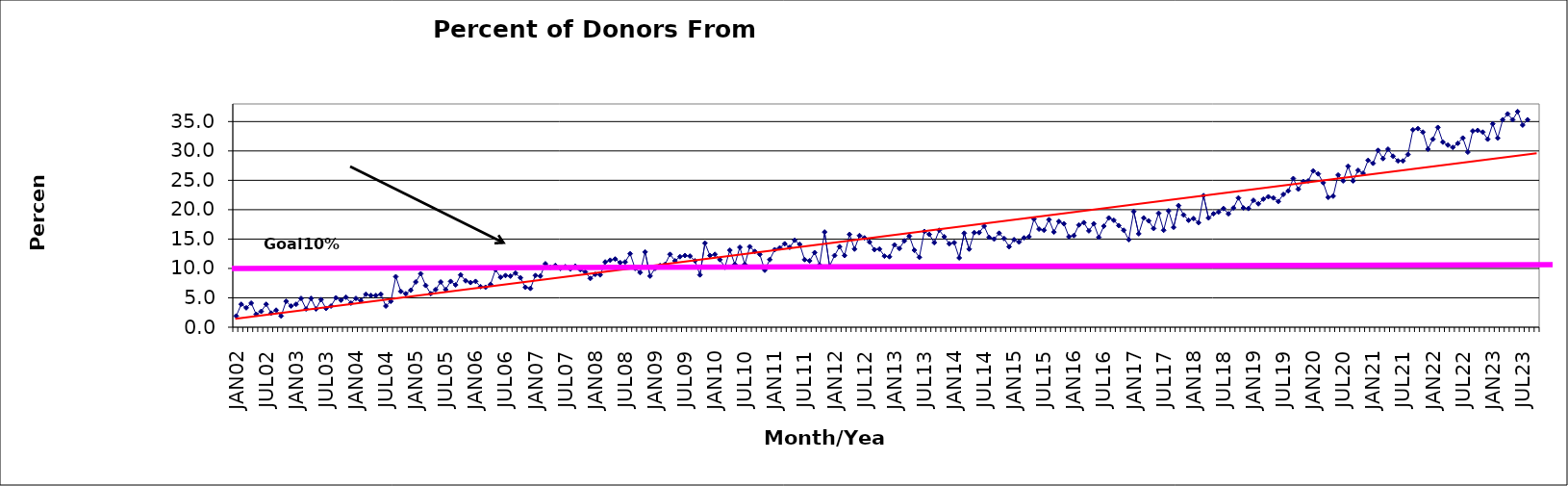
| Category | Series 0 |
|---|---|
| JAN02 | 1.9 |
| FEB02 | 3.9 |
| MAR02 | 3.3 |
| APR02 | 4.1 |
| MAY02 | 2.2 |
| JUN02 | 2.7 |
| JUL02 | 3.9 |
| AUG02 | 2.4 |
| SEP02 | 2.9 |
| OCT02 | 1.9 |
| NOV02 | 4.4 |
| DEC02 | 3.6 |
| JAN03 | 3.9 |
| FEB03 | 4.9 |
| MAR03 | 3.1 |
| APR03 | 4.9 |
| MAY03 | 3.1 |
| JUN03 | 4.7 |
| JUL03 | 3.2 |
| AUG03 | 3.6 |
| SEP03 | 5 |
| OCT03 | 4.6 |
| NOV03 | 5.1 |
| DEC03 | 4.1 |
| JAN04 | 4.9 |
| FEB04 | 4.5 |
| MAR04 | 5.6 |
| APR04 | 5.4 |
| MAY04 | 5.4 |
| JUN04 | 5.6 |
| JUL04 | 3.6 |
| AUG04 | 4.4 |
| SEP04 | 8.6 |
| OCT04 | 6.1 |
| NOV04 | 5.7 |
| DEC04 | 6.3 |
| JAN05 | 7.7 |
| FEB05 | 9.1 |
| MAR05 | 7.1 |
| APR05 | 5.7 |
| MAY05 | 6.4 |
| JUN05 | 7.7 |
| JUL05 | 6.4 |
| AUG05 | 7.8 |
| SEP05 | 7.2 |
| OCT05 | 8.9 |
| NOV05 | 7.9 |
| DEC05 | 7.6 |
| JAN06 | 7.8 |
| FEB06 | 6.9 |
| MAR06 | 6.8 |
| APR06 | 7.3 |
| MAY06 | 9.8 |
| JUN06 | 8.5 |
| JUL06 | 8.8 |
| AUG06 | 8.7 |
| SEP06 | 9.2 |
| OCT06 | 8.4 |
| NOV06 | 6.8 |
| DEC06 | 6.6 |
| JAN07 | 8.8 |
| FEB07 | 8.7 |
| MAR07 | 10.8 |
| APR07 | 10.2 |
| MAY07 | 10.5 |
| JUN07 | 10 |
| JUL07 | 10.3 |
| AUG07 | 9.9 |
| SEP07 | 10.4 |
| OCT07 | 9.8 |
| NOV07 | 9.4 |
| DEC07 | 8.3 |
| JAN08 | 9 |
| FEB08 | 8.9 |
| MAR08 | 11.1 |
| APR08 | 11.4 |
| MAY08 | 11.6 |
| JUN08 | 11 |
| JUL08 | 11.1 |
| AUG08 | 12.5 |
| SEP08 | 10 |
| OCT08 | 9.3 |
| NOV08 | 12.8 |
| DEC08 | 8.7 |
| JAN09 | 10 |
| FEB09 | 10.5 |
| MAR09 | 10.7 |
| APR09 | 12.4 |
| MAY09 | 11.3 |
| JUN09 | 12 |
| JUL09 | 12.2 |
| AUG09 | 12.1 |
| SEP09 | 11.3 |
| OCT09 | 8.9 |
| NOV09 | 14.3 |
| DEC09 | 12.2 |
| JAN10 | 12.4 |
| FEB10 | 11.5 |
| MAR10 | 10.2 |
| APR10 | 13.1 |
| MAY10 | 10.7 |
| JUN10 | 13.6 |
| JUL10 | 10.7 |
| AUG10 | 13.7 |
| SEP10 | 12.9 |
| OCT10 | 12.4 |
| NOV10 | 9.7 |
| DEC10 | 11.5 |
| JAN11 | 13.2 |
| FEB11 | 13.5 |
| MAR11 | 14.2 |
| APR11 | 13.6 |
| MAY11 | 14.8 |
| JUN11 | 14.1 |
| JUL11 | 11.5 |
| AUG11 | 11.3 |
| SEP11 | 12.7 |
| OCT11 | 10.6 |
| NOV11 | 16.2 |
| DEC11 | 10.4 |
| JAN12 | 12.2 |
| FEB12 | 13.7 |
| MAR12 | 12.2 |
| APR12 | 15.8 |
| MAY12 | 13.3 |
| JUN12 | 15.6 |
| JUL12 | 15.2 |
| AUG12 | 14.5 |
| SEP12 | 13.2 |
| OCT12 | 13.3 |
| NOV12 | 12.1 |
| DEC12 | 12 |
| JAN13 | 14 |
| FEB13 | 13.4 |
| MAR13 | 14.7 |
| APR13 | 15.5 |
| MAY13 | 13.1 |
| JUN13 | 11.9 |
| JUL13 | 16.3 |
| AUG13 | 15.8 |
| SEP13 | 14.4 |
| OCT13 | 16.5 |
| NOV13 | 15.4 |
| DEC13 | 14.2 |
| JAN14 | 14.4 |
| FEB14 | 11.8 |
| MAR14 | 16 |
| APR14 | 13.3 |
| MAY14 | 16.1 |
| JUN14 | 16.1 |
| JUL14 | 17.2 |
| AUG14 | 15.3 |
| SEP14 | 15 |
| OCT14 | 16 |
| NOV14 | 15.1 |
| DEC14 | 13.7 |
| JAN15 | 14.9 |
| FEB15 | 14.5 |
| MAR15 | 15.2 |
| APR15 | 15.4 |
| MAY15 | 18.4 |
| JUN15 | 16.7 |
| JUL15 | 16.5 |
| AUG15 | 18.3 |
| SEP15 | 16.2 |
| OCT15 | 18 |
| NOV15 | 17.6 |
| DEC15 | 15.4 |
| JAN16 | 15.6 |
| FEB16 | 17.4 |
| MAR16 | 17.8 |
| APR16 | 16.4 |
| MAY16 | 17.6 |
| JUN16 | 15.3 |
| JUL16 | 17.2 |
| AUG16 | 18.6 |
| SEP16 | 18.2 |
| OCT16 | 17.3 |
| NOV16 | 16.5 |
| DEC16 | 14.9 |
| JAN17 | 19.7 |
| FEB17 | 15.9 |
| MAR17 | 18.6 |
| APR17 | 18.1 |
| MAY17 | 16.8 |
| JUN17 | 19.4 |
| JUL17 | 16.5 |
| AUG17 | 19.8 |
| SEP17 | 17 |
| OCT17 | 20.7 |
| NOV17 | 19.1 |
| DEC17 | 18.2 |
| JAN18 | 18.5 |
| FEB18 | 17.8 |
| MAR18 | 22.4 |
| APR18 | 18.6 |
| MAY18 | 19.3 |
| JUN18 | 19.6 |
| JUL18 | 20.2 |
| AUG18 | 19.3 |
| SEP18 | 20.3 |
| OCT18 | 22 |
| NOV18 | 20.3 |
| DEC18 | 20.2 |
| JAN19 | 21.6 |
| FEB19 | 21 |
| MAR19 | 21.8 |
| APR19 | 22.2 |
| MAY19 | 22 |
| JUN19 | 21.4 |
| JUL19 | 22.6 |
| AUG19 | 23.2 |
| SEP19 | 25.3 |
| OCT19 | 23.5 |
| NOV19 | 24.8 |
| DEC19 | 24.9 |
| JAN20 | 26.6 |
| FEB20 | 26.1 |
| MAR20 | 24.6 |
| APR20 | 22.1 |
| MAY20 | 22.3 |
| JUN20 | 25.9 |
| JUL20 | 24.9 |
| AUG20 | 27.4 |
| SEP20 | 24.9 |
| OCT20 | 26.7 |
| NOV20 | 26.2 |
| DEC20 | 28.4 |
| JAN21 | 27.9 |
| FEB21 | 30.1 |
| MAR21 | 28.7 |
| APR21 | 30.3 |
| MAY21 | 29.1 |
| JUN21 | 28.3 |
| JUL21 | 28.3 |
| AUG21 | 29.4 |
| SEP21 | 33.6 |
| OCT21 | 33.8 |
| NOV21 | 33.2 |
| DEC21 | 30.3 |
| JAN22 | 32 |
| FEB22 | 34 |
| MAR22 | 31.5 |
| APR22 | 31 |
| MAY22 | 30.6 |
| JUN22 | 31.3 |
| JUL22 | 32.2 |
| AUG22 | 29.8 |
| SEP22 | 33.4 |
| OCT22 | 33.5 |
| NOV22 | 33.2 |
| DEC22 | 32 |
| JAN23 | 34.6 |
| FEB23 | 32.2 |
| MAR23 | 35.3 |
| APR23 | 36.3 |
| MAY23 | 35.3 |
| JUN23 | 36.7 |
| JUL23 | 34.4 |
| AUG23 | 35.3 |